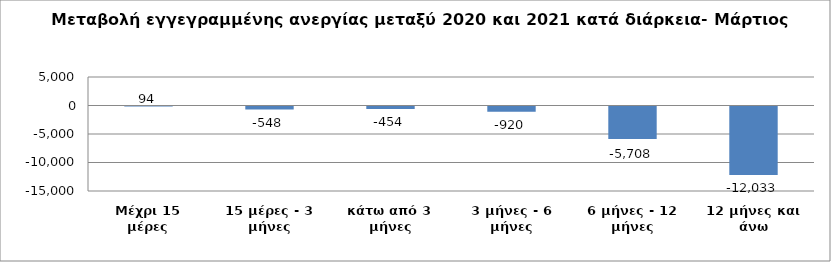
| Category | Series 0 |
|---|---|
| Μέχρι 15 μέρες | 94 |
| 15 μέρες - 3 μήνες | -548 |
| κάτω από 3 μήνες | -454 |
| 3 μήνες - 6 μήνες | -920 |
| 6 μήνες - 12 μήνες | -5708 |
| 12 μήνες και άνω | -12033 |